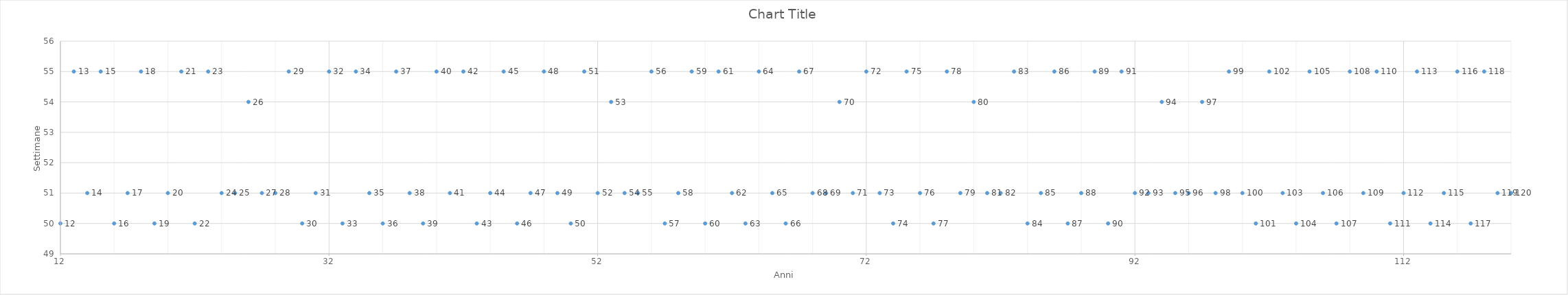
| Category | Series 0 |
|---|---|
| 12.0 | 50 |
| 13.0 | 55 |
| 14.0 | 51 |
| 15.0 | 55 |
| 16.0 | 50 |
| 17.0 | 51 |
| 18.0 | 55 |
| 19.0 | 50 |
| 20.0 | 51 |
| 21.0 | 55 |
| 22.0 | 50 |
| 23.0 | 55 |
| 24.0 | 51 |
| 25.0 | 51 |
| 26.0 | 54 |
| 27.0 | 51 |
| 28.0 | 51 |
| 29.0 | 55 |
| 30.0 | 50 |
| 31.0 | 51 |
| 32.0 | 55 |
| 33.0 | 50 |
| 34.0 | 55 |
| 35.0 | 51 |
| 36.0 | 50 |
| 37.0 | 55 |
| 38.0 | 51 |
| 39.0 | 50 |
| 40.0 | 55 |
| 41.0 | 51 |
| 42.0 | 55 |
| 43.0 | 50 |
| 44.0 | 51 |
| 45.0 | 55 |
| 46.0 | 50 |
| 47.0 | 51 |
| 48.0 | 55 |
| 49.0 | 51 |
| 50.0 | 50 |
| 51.0 | 55 |
| 52.0 | 51 |
| 53.0 | 54 |
| 54.0 | 51 |
| 55.0 | 51 |
| 56.0 | 55 |
| 57.0 | 50 |
| 58.0 | 51 |
| 59.0 | 55 |
| 60.0 | 50 |
| 61.0 | 55 |
| 62.0 | 51 |
| 63.0 | 50 |
| 64.0 | 55 |
| 65.0 | 51 |
| 66.0 | 50 |
| 67.0 | 55 |
| 68.0 | 51 |
| 69.0 | 51 |
| 70.0 | 54 |
| 71.0 | 51 |
| 72.0 | 55 |
| 73.0 | 51 |
| 74.0 | 50 |
| 75.0 | 55 |
| 76.0 | 51 |
| 77.0 | 50 |
| 78.0 | 55 |
| 79.0 | 51 |
| 80.0 | 54 |
| 81.0 | 51 |
| 82.0 | 51 |
| 83.0 | 55 |
| 84.0 | 50 |
| 85.0 | 51 |
| 86.0 | 55 |
| 87.0 | 50 |
| 88.0 | 51 |
| 89.0 | 55 |
| 90.0 | 50 |
| 91.0 | 55 |
| 92.0 | 51 |
| 93.0 | 51 |
| 94.0 | 54 |
| 95.0 | 51 |
| 96.0 | 51 |
| 97.0 | 54 |
| 98.0 | 51 |
| 99.0 | 55 |
| 100.0 | 51 |
| 101.0 | 50 |
| 102.0 | 55 |
| 103.0 | 51 |
| 104.0 | 50 |
| 105.0 | 55 |
| 106.0 | 51 |
| 107.0 | 50 |
| 108.0 | 55 |
| 109.0 | 51 |
| 110.0 | 55 |
| 111.0 | 50 |
| 112.0 | 51 |
| 113.0 | 55 |
| 114.0 | 50 |
| 115.0 | 51 |
| 116.0 | 55 |
| 117.0 | 50 |
| 118.0 | 55 |
| 119.0 | 51 |
| 120.0 | 51 |